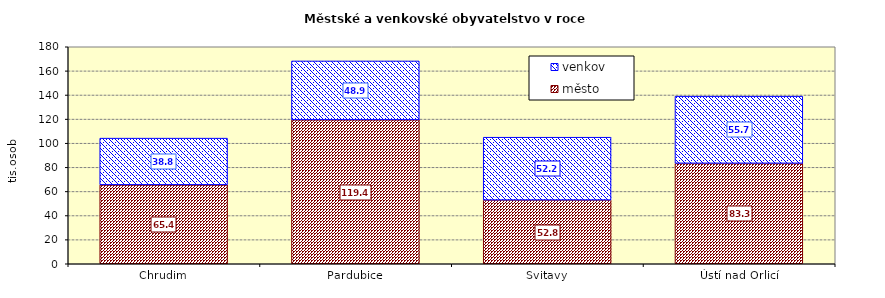
| Category | město | venkov |
|---|---|---|
| Chrudim | 65431 | 38775 |
| Pardubice | 119366 | 48871 |
| Svitavy | 52797 | 52174 |
| Ústí nad Orlicí | 83310 | 55716 |